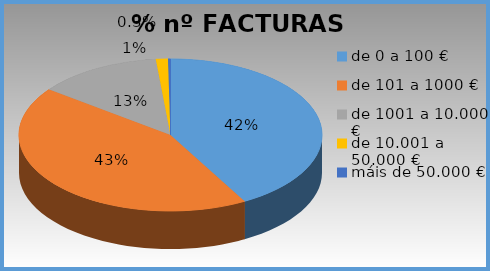
| Category | Series 0 |
|---|---|
| de 0 a 100 € | 0.419 |
| de 101 a 1000 € | 0.434 |
| de 1001 a 10.000 € | 0.132 |
| de 10.001 a 50.000 € | 0.013 |
| máis de 50.000 € | 0.003 |